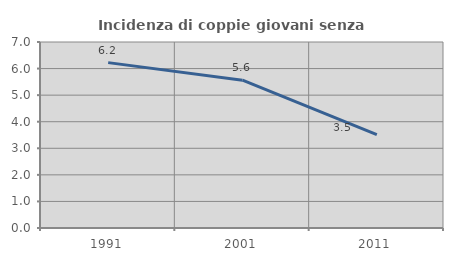
| Category | Incidenza di coppie giovani senza figli |
|---|---|
| 1991.0 | 6.224 |
| 2001.0 | 5.564 |
| 2011.0 | 3.511 |